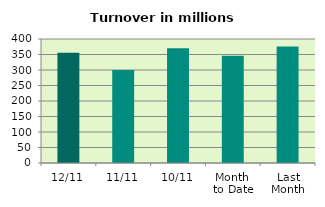
| Category | Series 0 |
|---|---|
| 12/11 | 355.969 |
| 11/11 | 299.614 |
| 10/11 | 370.509 |
| Month 
to Date | 345.672 |
| Last
Month | 375.959 |